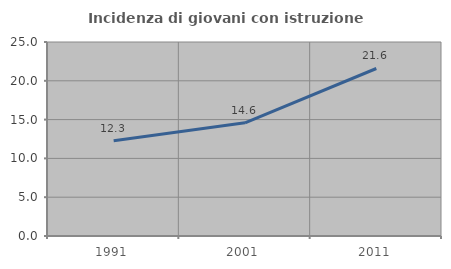
| Category | Incidenza di giovani con istruzione universitaria |
|---|---|
| 1991.0 | 12.288 |
| 2001.0 | 14.592 |
| 2011.0 | 21.586 |